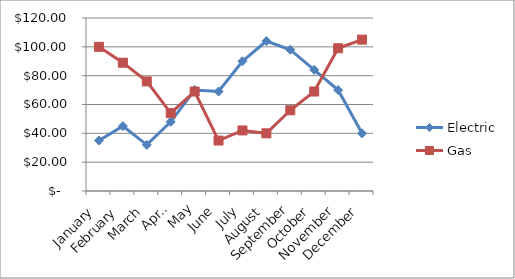
| Category | Electric | Gas |
|---|---|---|
| January | 35 | 100 |
| February | 45 | 89 |
| March | 32 | 76 |
| April | 48 | 54 |
| May | 70 | 69 |
| June | 69 | 35 |
| July | 90 | 42 |
| August | 104 | 40 |
| September | 98 | 56 |
| October | 84 | 69 |
| November | 70 | 99 |
| December | 40 | 105 |